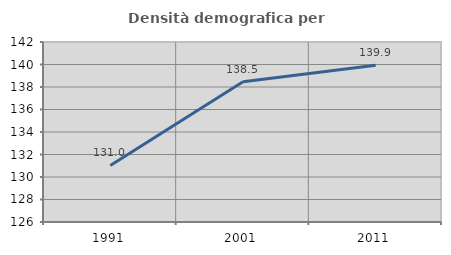
| Category | Densità demografica |
|---|---|
| 1991.0 | 131.031 |
| 2001.0 | 138.472 |
| 2011.0 | 139.93 |